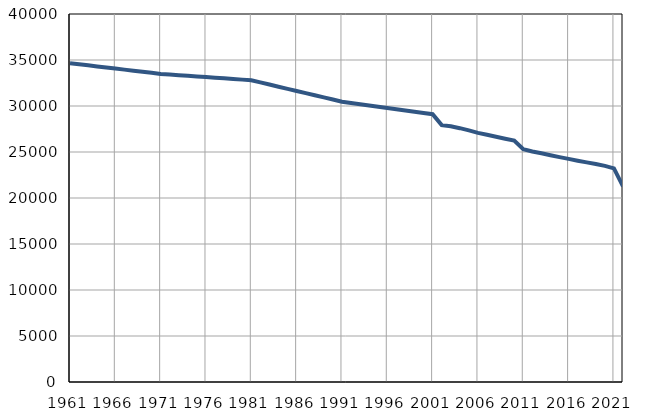
| Category | Број
становника |
|---|---|
| 1961.0 | 34654 |
| 1962.0 | 34538 |
| 1963.0 | 34422 |
| 1964.0 | 34305 |
| 1965.0 | 34188 |
| 1966.0 | 34071 |
| 1967.0 | 33955 |
| 1968.0 | 33839 |
| 1969.0 | 33722 |
| 1970.0 | 33606 |
| 1971.0 | 33489 |
| 1972.0 | 33420 |
| 1973.0 | 33352 |
| 1974.0 | 33282 |
| 1975.0 | 33213 |
| 1976.0 | 33144 |
| 1977.0 | 33073 |
| 1978.0 | 33005 |
| 1979.0 | 32936 |
| 1980.0 | 32867 |
| 1981.0 | 32798 |
| 1982.0 | 32565 |
| 1983.0 | 32332 |
| 1984.0 | 32099 |
| 1985.0 | 31866 |
| 1986.0 | 31634 |
| 1987.0 | 31401 |
| 1988.0 | 31168 |
| 1989.0 | 30935 |
| 1990.0 | 30702 |
| 1991.0 | 30469 |
| 1992.0 | 30332 |
| 1993.0 | 30196 |
| 1994.0 | 30059 |
| 1995.0 | 29923 |
| 1996.0 | 29786 |
| 1997.0 | 29650 |
| 1998.0 | 29513 |
| 1999.0 | 29377 |
| 2000.0 | 29240 |
| 2001.0 | 29104 |
| 2002.0 | 27922 |
| 2003.0 | 27792 |
| 2004.0 | 27590 |
| 2005.0 | 27352 |
| 2006.0 | 27081 |
| 2007.0 | 26867 |
| 2008.0 | 26662 |
| 2009.0 | 26447 |
| 2010.0 | 26247 |
| 2011.0 | 25310 |
| 2012.0 | 25056 |
| 2013.0 | 24864 |
| 2014.0 | 24650 |
| 2015.0 | 24443 |
| 2016.0 | 24249 |
| 2017.0 | 24054 |
| 2018.0 | 23874 |
| 2019.0 | 23696 |
| 2020.0 | 23489 |
| 2021.0 | 23218 |
| 2022.0 | 21262 |